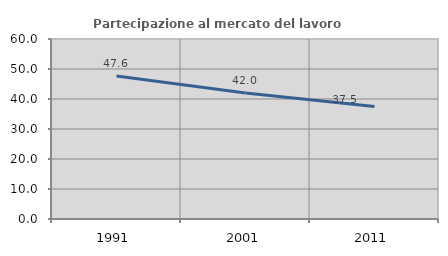
| Category | Partecipazione al mercato del lavoro  femminile |
|---|---|
| 1991.0 | 47.638 |
| 2001.0 | 42.007 |
| 2011.0 | 37.511 |